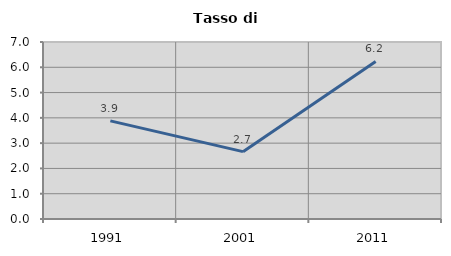
| Category | Tasso di disoccupazione   |
|---|---|
| 1991.0 | 3.88 |
| 2001.0 | 2.664 |
| 2011.0 | 6.229 |